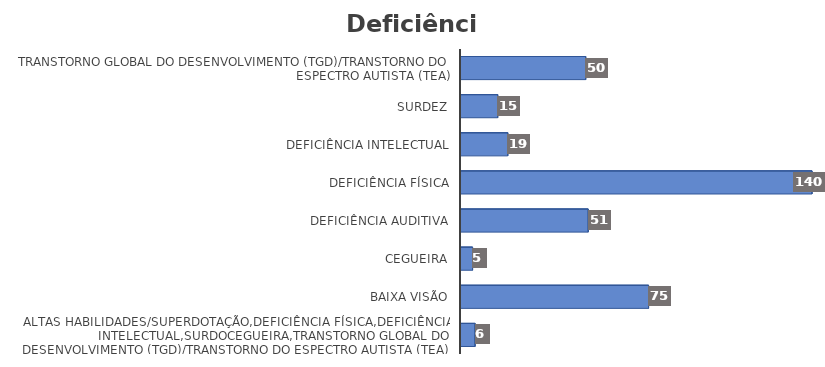
| Category | Series 0 |
|---|---|
| Altas habilidades/superdotação,Deficiência física,Deficiência intelectual,Surdocegueira,Transtorno global do desenvolvimento (TGD)/Transtorno do espectro autista (TEA) | 6 |
| Baixa visão | 75 |
| Cegueira | 5 |
| Deficiência auditiva | 51 |
| Deficiência física | 140 |
| Deficiência intelectual | 19 |
| Surdez | 15 |
| Transtorno global do desenvolvimento (TGD)/Transtorno do espectro autista (TEA) | 50 |